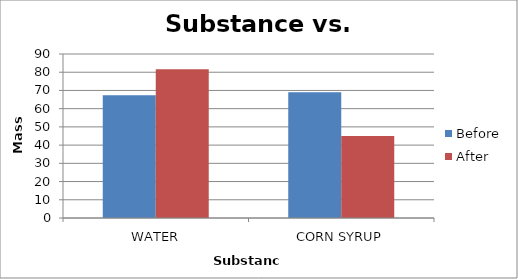
| Category | Before | After |
|---|---|---|
|  WATER | 67.4 | 81.6 |
| CORN SYRUP | 69 | 45 |